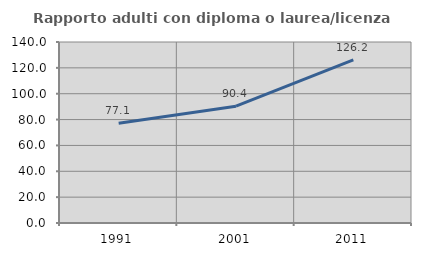
| Category | Rapporto adulti con diploma o laurea/licenza media  |
|---|---|
| 1991.0 | 77.143 |
| 2001.0 | 90.385 |
| 2011.0 | 126.19 |